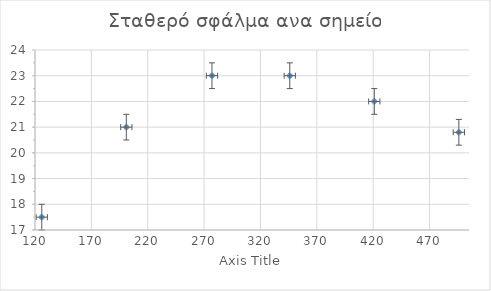
| Category | Series 0 |
|---|---|
| 126.0 | 17.5 |
| 201.0 | 21 |
| 277.0 | 23 |
| 346.0 | 23 |
| 421.0 | 22 |
| 496.0 | 20.8 |